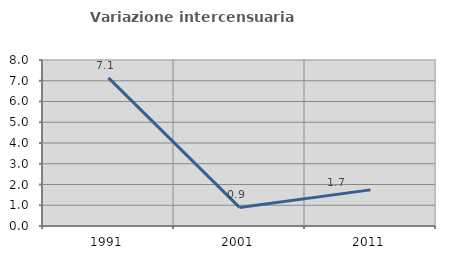
| Category | Variazione intercensuaria annua |
|---|---|
| 1991.0 | 7.14 |
| 2001.0 | 0.897 |
| 2011.0 | 1.741 |